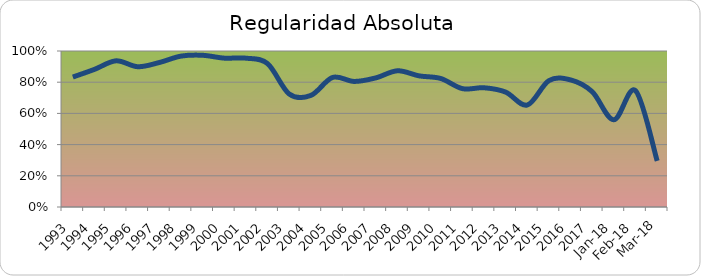
| Category | Series 0 |
|---|---|
| 1993.0 | 0.833 |
| 1994.0 | 0.882 |
| 1995.0 | 0.937 |
| 1996.0 | 0.899 |
| 1997.0 | 0.926 |
| 1998.0 | 0.967 |
| 1999.0 | 0.973 |
| 2000.0 | 0.954 |
| 2001.0 | 0.954 |
| 2002.0 | 0.919 |
| 2003.0 | 0.724 |
| 2004.0 | 0.715 |
| 2005.0 | 0.83 |
| 2006.0 | 0.805 |
| 2007.0 | 0.828 |
| 2008.0 | 0.873 |
| 2009.0 | 0.841 |
| 2010.0 | 0.824 |
| 2011.0 | 0.759 |
| 2012.0 | 0.764 |
| 2013.0 | 0.736 |
| 2014.0 | 0.654 |
| 2015.0 | 0.81 |
| 2016.0 | 0.815 |
| 2017.0 | 0.739 |
| 43101.0 | 0.559 |
| 43132.0 | 0.746 |
| 43160.0 | 0.295 |